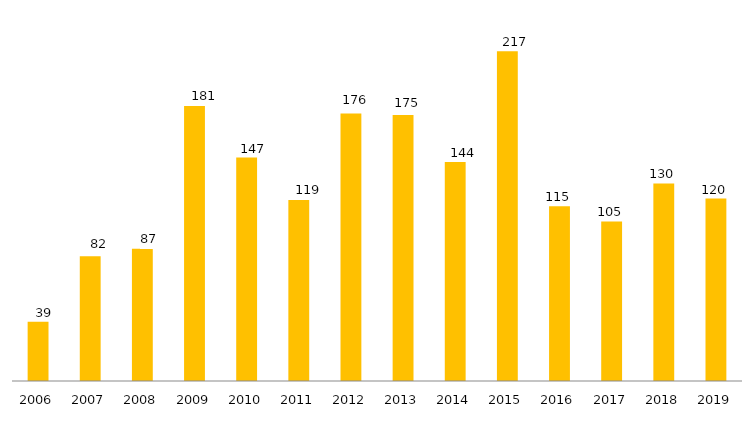
| Category | Iniciados (por exercício) |
|---|---|
| 2006.0 | 39 |
| 2007.0 | 82 |
| 2008.0 | 87 |
| 2009.0 | 181 |
| 2010.0 | 147 |
| 2011.0 | 119 |
| 2012.0 | 176 |
| 2013.0 | 175 |
| 2014.0 | 144 |
| 2015.0 | 217 |
| 2016.0 | 115 |
| 2017.0 | 105 |
| 2018.0 | 130 |
| 2019.0 | 120 |